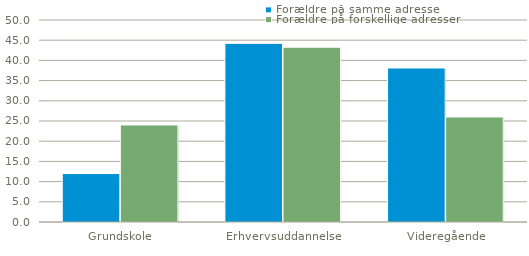
| Category | Forældre på samme adresse | Forældre på forskellige adresser |
|---|---|---|
| Grundskole | 11.994 | 24.018 |
| Erhvervsuddannelse | 44.215 | 43.259 |
| Videregående | 38.124 | 25.996 |